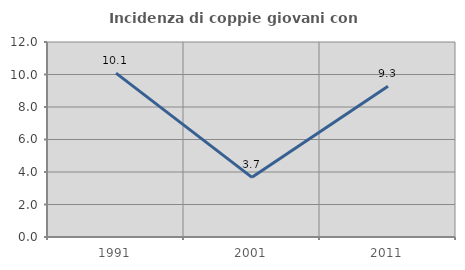
| Category | Incidenza di coppie giovani con figli |
|---|---|
| 1991.0 | 10.084 |
| 2001.0 | 3.67 |
| 2011.0 | 9.278 |